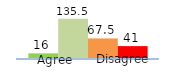
| Category | Series 0 | Series 1 | Series 2 | Series 3 |
|---|---|---|---|---|
| 0 | 16 | 135.5 | 67.5 | 41 |